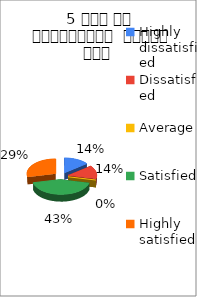
| Category | 5 समय पर पाठ्यक्रम  पूर्ण हुआ  |
|---|---|
| Highly dissatisfied | 1 |
| Dissatisfied | 1 |
| Average | 0 |
| Satisfied | 3 |
| Highly satisfied | 2 |